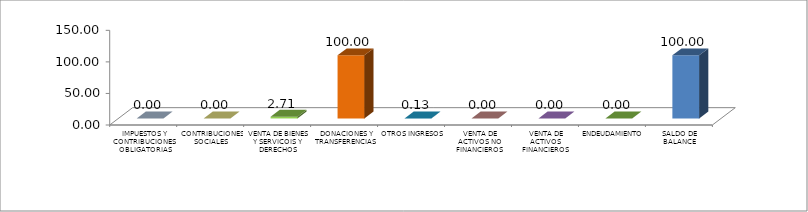
| Category | Series 0 |
|---|---|
|  IMPUESTOS Y CONTRIBUCIONES OBLIGATORIAS | 0 |
|  CONTRIBUCIONES SOCIALES | 0 |
|  VENTA DE BIENES Y SERVICOIS Y DERECHOS ADMINISTRATIVOS | 2.709 |
|  DONACIONES Y TRANSFERENCIAS | 100 |
|  OTROS INGRESOS | 0.134 |
|  VENTA DE ACTIVOS NO FINANCIEROS | 0 |
|  VENTA DE ACTIVOS FINANCIEROS | 0 |
|  ENDEUDAMIENTO | 0 |
|  SALDO DE BALANCE | 100 |